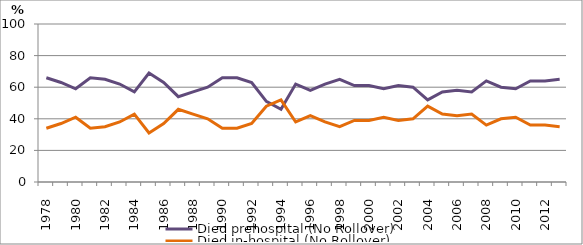
| Category | Died prehospital (No Rollover) | Died in-hospital (No Rollover) |
|---|---|---|
| 1978.0 | 66 | 34 |
| 1979.0 | 63 | 37 |
| 1980.0 | 59 | 41 |
| 1981.0 | 66 | 34 |
| 1982.0 | 65 | 35 |
| 1983.0 | 62 | 38 |
| 1984.0 | 57 | 43 |
| 1985.0 | 69 | 31 |
| 1986.0 | 63 | 37 |
| 1987.0 | 54 | 46 |
| 1988.0 | 57 | 43 |
| 1989.0 | 60 | 40 |
| 1990.0 | 66 | 34 |
| 1991.0 | 66 | 34 |
| 1992.0 | 63 | 37 |
| 1993.0 | 51 | 48 |
| 1994.0 | 46 | 52 |
| 1995.0 | 62 | 38 |
| 1996.0 | 58 | 42 |
| 1997.0 | 62 | 38 |
| 1998.0 | 65 | 35 |
| 1999.0 | 61 | 39 |
| 2000.0 | 61 | 39 |
| 2001.0 | 59 | 41 |
| 2002.0 | 61 | 39 |
| 2003.0 | 60 | 40 |
| 2004.0 | 52 | 48 |
| 2005.0 | 57 | 43 |
| 2006.0 | 58 | 42 |
| 2007.0 | 57 | 43 |
| 2008.0 | 64 | 36 |
| 2009.0 | 60 | 40 |
| 2010.0 | 59 | 41 |
| 2011.0 | 64 | 36 |
| 2012.0 | 64 | 36 |
| 2013.0 | 65 | 35 |